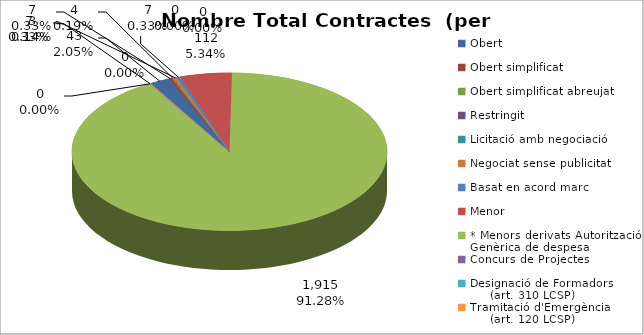
| Category | Nombre Total Contractes |
|---|---|
| Obert | 43 |
| Obert simplificat | 7 |
| Obert simplificat abreujat | 4 |
| Restringit | 0 |
| Licitació amb negociació | 0 |
| Negociat sense publicitat | 7 |
| Basat en acord marc | 7 |
| Menor | 112 |
| * Menors derivats Autorització Genèrica de despesa | 1915 |
| Concurs de Projectes | 0 |
| Designació de Formadors
     (art. 310 LCSP) | 0 |
| Tramitació d'Emergència
     (art. 120 LCSP) | 3 |